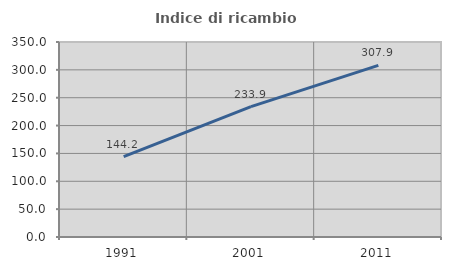
| Category | Indice di ricambio occupazionale  |
|---|---|
| 1991.0 | 144.2 |
| 2001.0 | 233.879 |
| 2011.0 | 307.925 |